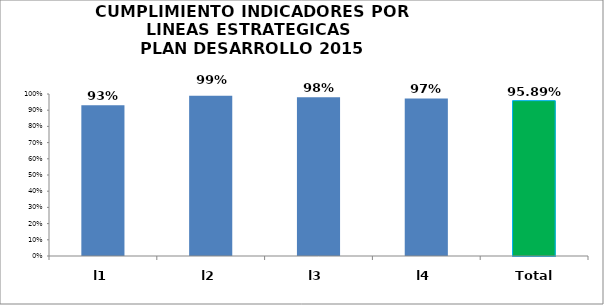
| Category | CUMPLIMIENTO |
|---|---|
| l1 | 0.931 |
| l2 | 0.989 |
| l3 | 0.98 |
| l4 | 0.973 |
| Total | 0.959 |